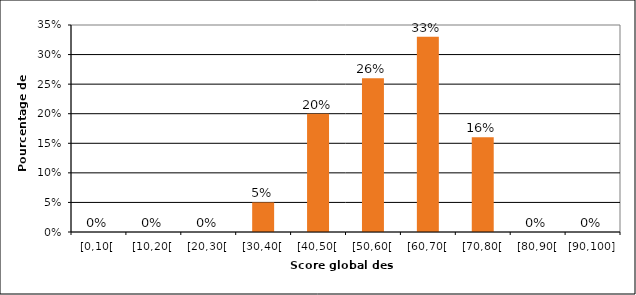
| Category | Series 0 | Series 1 |
|---|---|---|
| [0,10[ |  | 0 |
| [10,20[ |  | 0 |
| [20,30[ |  | 0 |
| [30,40[ |  | 0.05 |
| [40,50[ |  | 0.2 |
| [50,60[ |  | 0.26 |
| [60,70[ |  | 0.33 |
| [70,80[ |  | 0.16 |
| [80,90[ |  | 0 |
| [90,100] |  | 0 |